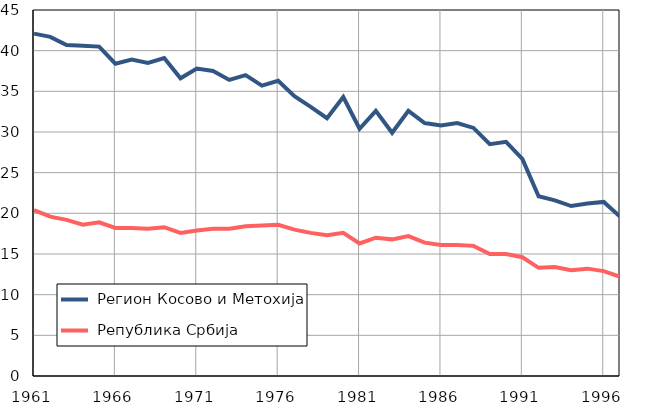
| Category |  Регион Косово и Метохија |  Република Србија |
|---|---|---|
| 1961.0 | 42.1 | 20.4 |
| 1962.0 | 41.7 | 19.6 |
| 1963.0 | 40.7 | 19.2 |
| 1964.0 | 40.6 | 18.6 |
| 1965.0 | 40.5 | 18.9 |
| 1966.0 | 38.4 | 18.2 |
| 1967.0 | 38.9 | 18.2 |
| 1968.0 | 38.5 | 18.1 |
| 1969.0 | 39.1 | 18.3 |
| 1970.0 | 36.6 | 17.6 |
| 1971.0 | 37.8 | 17.9 |
| 1972.0 | 37.5 | 18.1 |
| 1973.0 | 36.4 | 18.1 |
| 1974.0 | 37 | 18.4 |
| 1975.0 | 35.7 | 18.5 |
| 1976.0 | 36.3 | 18.6 |
| 1977.0 | 34.4 | 18 |
| 1978.0 | 33.1 | 17.6 |
| 1979.0 | 31.7 | 17.3 |
| 1980.0 | 34.3 | 17.6 |
| 1981.0 | 30.4 | 16.3 |
| 1982.0 | 32.6 | 17 |
| 1983.0 | 29.9 | 16.8 |
| 1984.0 | 32.6 | 17.2 |
| 1985.0 | 31.1 | 16.4 |
| 1986.0 | 30.8 | 16.1 |
| 1987.0 | 31.1 | 16.1 |
| 1988.0 | 30.5 | 16 |
| 1989.0 | 28.5 | 15 |
| 1990.0 | 28.8 | 15 |
| 1991.0 | 26.7 | 14.6 |
| 1992.0 | 22.1 | 13.3 |
| 1993.0 | 21.6 | 13.4 |
| 1994.0 | 20.9 | 13 |
| 1995.0 | 21.2 | 13.2 |
| 1996.0 | 21.4 | 12.9 |
| 1997.0 | 19.6 | 12.2 |